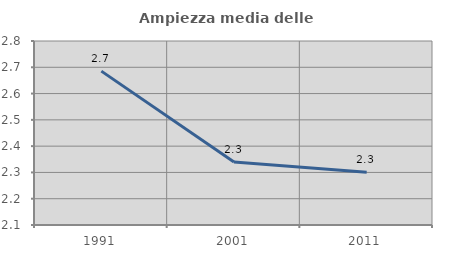
| Category | Ampiezza media delle famiglie |
|---|---|
| 1991.0 | 2.685 |
| 2001.0 | 2.34 |
| 2011.0 | 2.301 |